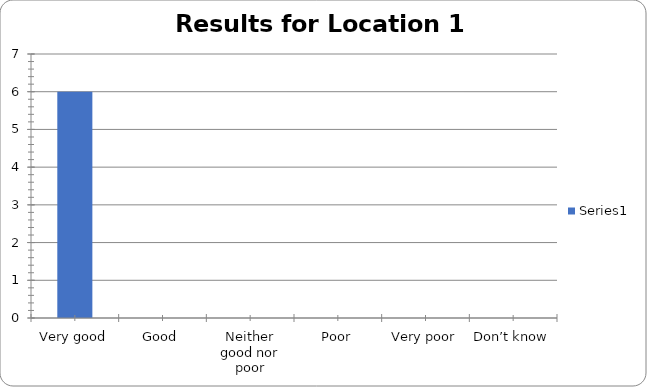
| Category | Series 0 |
|---|---|
| Very good | 6 |
| Good | 0 |
| Neither good nor poor | 0 |
| Poor | 0 |
| Very poor | 0 |
| Don’t know | 0 |